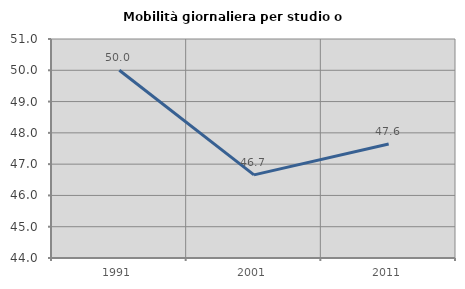
| Category | Mobilità giornaliera per studio o lavoro |
|---|---|
| 1991.0 | 50 |
| 2001.0 | 46.657 |
| 2011.0 | 47.642 |